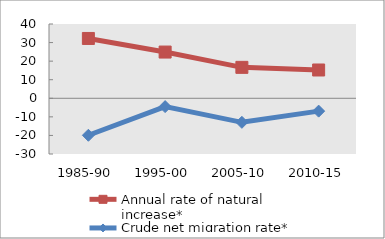
| Category | Annual rate of natural increase* | Crude net migration rate* |
|---|---|---|
| 1985-90 | 32.217 | -19.92 |
| 1995-00 | 24.89 | -4.484 |
| 2005-10 | 16.654 | -12.949 |
| 2010-15 | 15.234 | -6.914 |